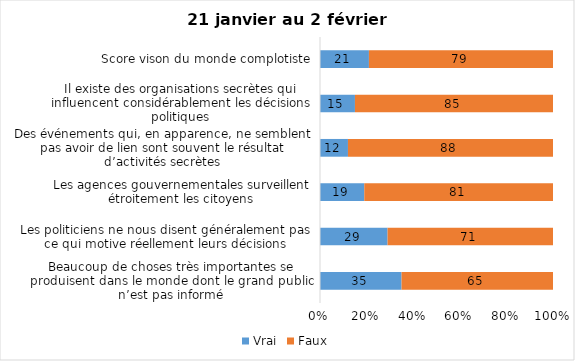
| Category | Vrai | Faux |
|---|---|---|
| Beaucoup de choses très importantes se produisent dans le monde dont le grand public n’est pas informé | 35 | 65 |
| Les politiciens ne nous disent généralement pas ce qui motive réellement leurs décisions | 29 | 71 |
| Les agences gouvernementales surveillent étroitement les citoyens | 19 | 81 |
| Des événements qui, en apparence, ne semblent pas avoir de lien sont souvent le résultat d’activités secrètes | 12 | 88 |
| Il existe des organisations secrètes qui influencent considérablement les décisions politiques | 15 | 85 |
| Score vison du monde complotiste | 21 | 79 |